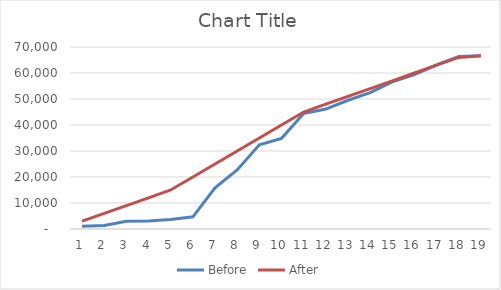
| Category | Before | After |
|---|---|---|
| 0 | 1031 | 3000 |
| 1 | 1372 | 6000 |
| 2 | 3001 | 9000 |
| 3 | 3068 | 12000 |
| 4 | 3660 | 15000 |
| 5 | 4687 | 20000 |
| 6 | 15819 | 25000 |
| 7 | 22737 | 30000 |
| 8 | 32371 | 35000 |
| 9 | 34874 | 40000 |
| 10 | 44395 | 45000 |
| 11 | 46120 | 48000 |
| 12 | 49518 | 51000 |
| 13 | 52426 | 54000 |
| 14 | 56607 | 57000 |
| 15 | 59366 | 60000 |
| 16 | 63116 | 63000 |
| 17 | 66337 | 66000 |
| 18 | 66637 | 66637 |